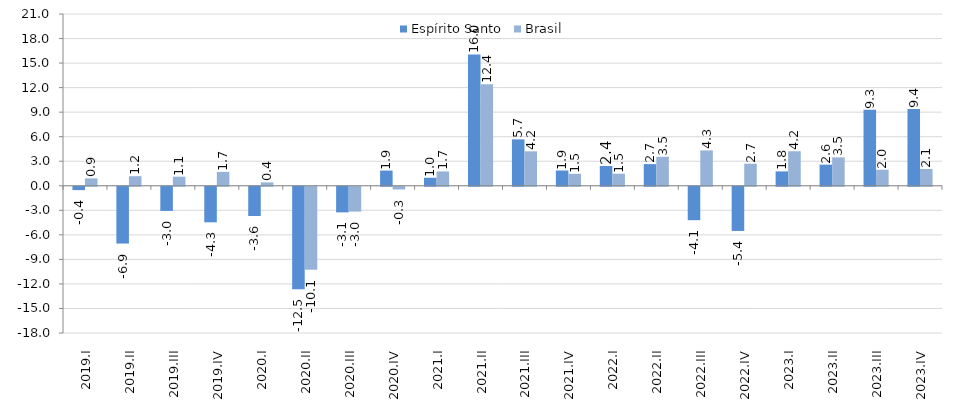
| Category | Espírito Santo | Brasil |
|---|---|---|
| 2019.I | -0.407 | 0.901 |
| 2019.II | -6.942 | 1.173 |
| 2019.III | -2.953 | 1.11 |
| 2019.IV | -4.346 | 1.694 |
| 2020.I | -3.575 | 0.414 |
| 2020.II | -12.544 | -10.138 |
| 2020.III | -3.132 | -3.036 |
| 2020.IV | 1.859 | -0.334 |
| 2021.I | 0.979 | 1.75 |
| 2021.II | 16.049 | 12.397 |
| 2021.III | 5.673 | 4.213 |
| 2021.IV | 1.866 | 1.459 |
| 2022.I | 2.417 | 1.473 |
| 2022.II | 2.65 | 3.544 |
| 2022.III | -4.086 | 4.322 |
| 2022.IV | -5.401 | 2.694 |
| 2023.I | 1.758 | 4.221 |
| 2023.II | 2.582 | 3.468 |
| 2023.III | 9.28 | 1.96 |
| 2023.IV | 9.375 | 2.053 |